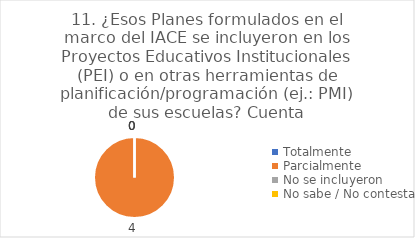
| Category | 11. ¿Esos Planes formulados en el marco del IACE se incluyeron en los Proyectos Educativos Institucionales (PEI) o en otras herramientas de planificación/programación (ej.: PMI) de sus escuelas? |
|---|---|
| Totalmente  | 0 |
| Parcialmente  | 1 |
| No se incluyeron  | 0 |
| No sabe / No contesta | 0 |